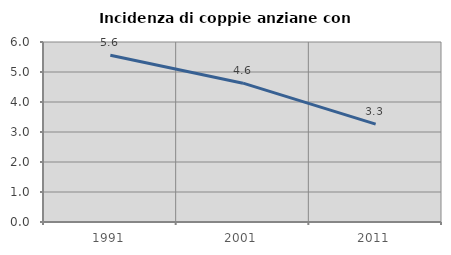
| Category | Incidenza di coppie anziane con figli |
|---|---|
| 1991.0 | 5.556 |
| 2001.0 | 4.627 |
| 2011.0 | 3.263 |